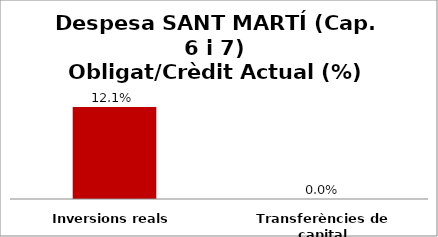
| Category | Series 0 |
|---|---|
| Inversions reals | 0.121 |
| Transferències de capital | 0 |